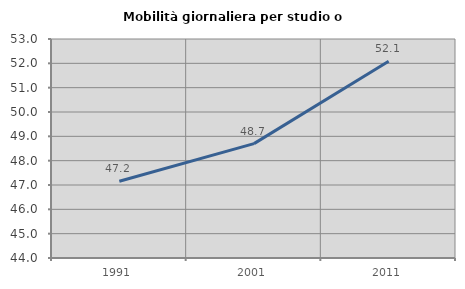
| Category | Mobilità giornaliera per studio o lavoro |
|---|---|
| 1991.0 | 47.153 |
| 2001.0 | 48.701 |
| 2011.0 | 52.088 |